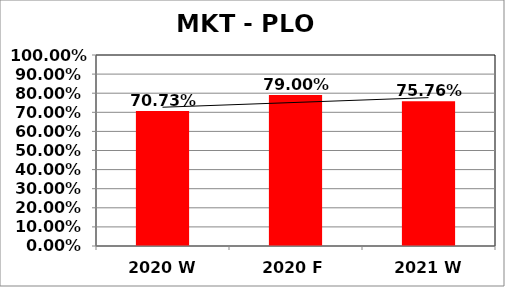
| Category | Series 0 |
|---|---|
| 2020 W | 0.707 |
| 2020 F | 0.79 |
| 2021 W | 0.758 |